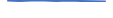
| Category | Series 0 |
|---|---|
| 0 | 15 |
| 1 | 10 |
| 2 | 16 |
| 3 | 14 |
| 4 | 11 |
| 5 | 14 |
| 6 | 10 |
| 7 | 8 |
| 8 | 4 |